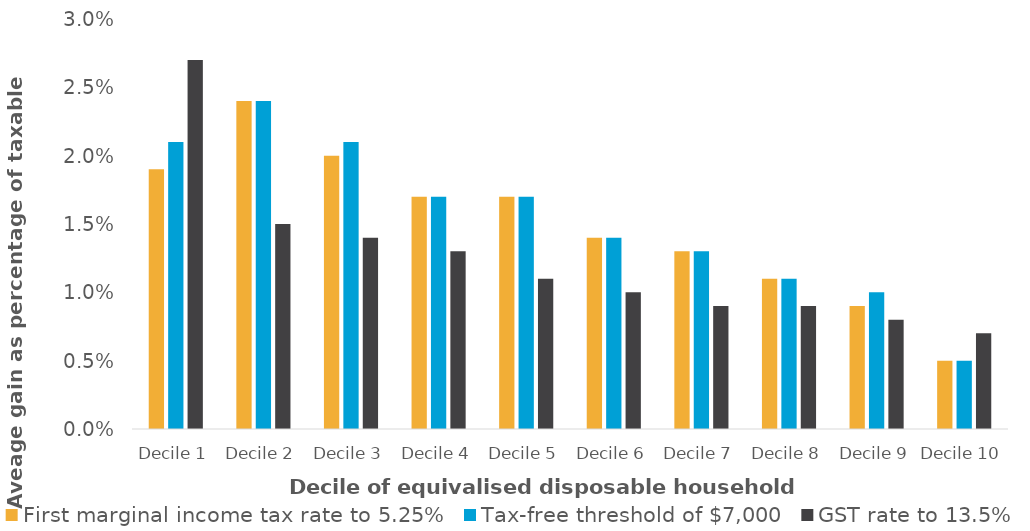
| Category | First marginal income tax rate to 5.25% | Tax-free threshold of $7,000 | GST rate to 13.5% |
|---|---|---|---|
| Decile 1 | 0.019 | 0.021 | 0.027 |
| Decile 2 | 0.024 | 0.024 | 0.015 |
| Decile 3 | 0.02 | 0.021 | 0.014 |
| Decile 4 | 0.017 | 0.017 | 0.013 |
| Decile 5 | 0.017 | 0.017 | 0.011 |
| Decile 6 | 0.014 | 0.014 | 0.01 |
| Decile 7 | 0.013 | 0.013 | 0.009 |
| Decile 8 | 0.011 | 0.011 | 0.009 |
| Decile 9 | 0.009 | 0.01 | 0.008 |
| Decile 10 | 0.005 | 0.005 | 0.007 |